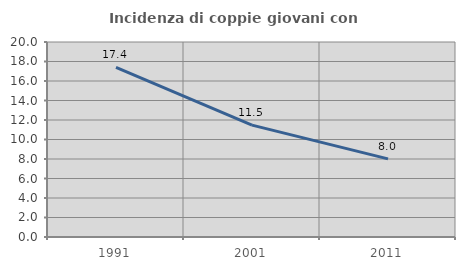
| Category | Incidenza di coppie giovani con figli |
|---|---|
| 1991.0 | 17.403 |
| 2001.0 | 11.471 |
| 2011.0 | 8.016 |